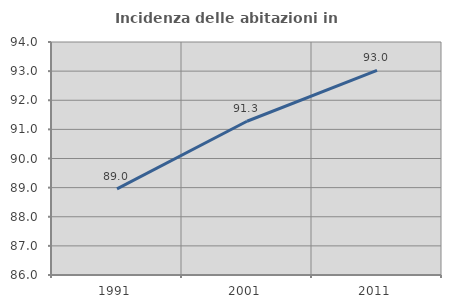
| Category | Incidenza delle abitazioni in proprietà  |
|---|---|
| 1991.0 | 88.957 |
| 2001.0 | 91.279 |
| 2011.0 | 93.028 |